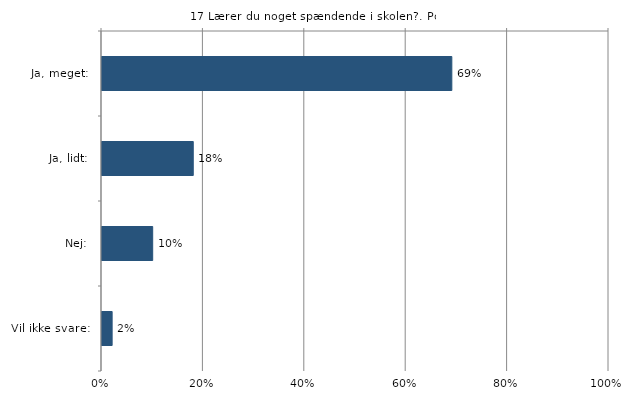
| Category | Lærer du noget spændende i skolen? |
|---|---|
| Ja, meget:  | 0.69 |
| Ja, lidt:  | 0.18 |
| Nej:  | 0.1 |
| Vil ikke svare:  | 0.02 |